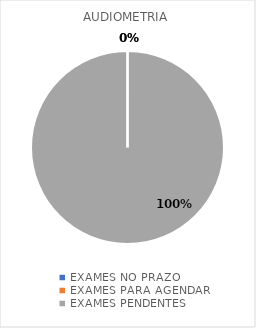
| Category | AUDIOMETRIA |
|---|---|
| EXAMES NO PRAZO | 0 |
| EXAMES PARA AGENDAR | 0 |
| EXAMES PENDENTES | 6 |